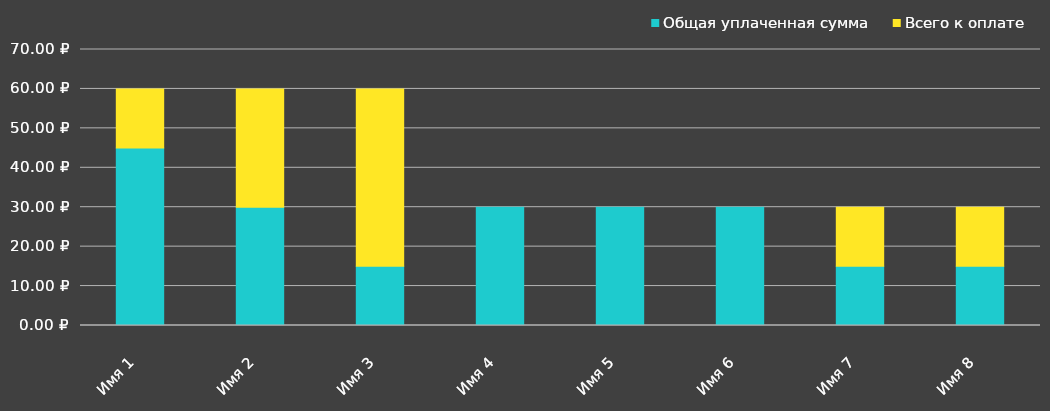
| Category | Общая уплаченная сумма | Всего к оплате |
|---|---|---|
| Имя 1 | 45 | 15 |
| Имя 2 | 30 | 30 |
| Имя 3 | 15 | 45 |
| Имя 4 | 30 | 0 |
| Имя 5 | 30 | 0 |
| Имя 6 | 30 | 0 |
| Имя 7 | 15 | 15 |
| Имя 8 | 15 | 15 |